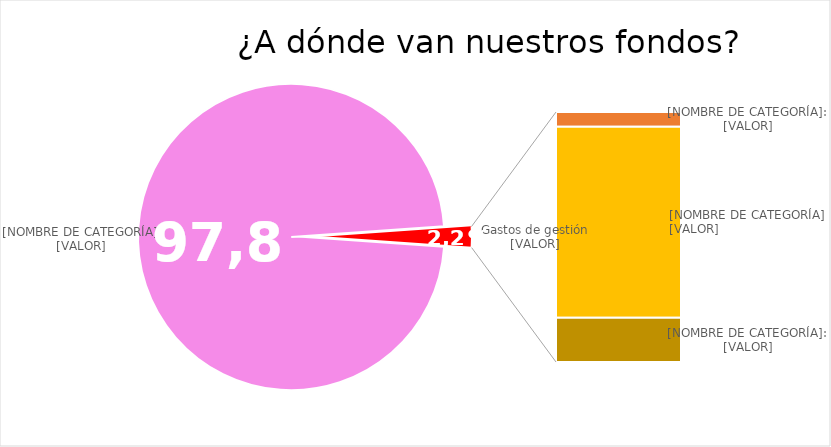
| Category | Series 0 |
|---|---|
| Ahorro | 7494.22 |
| Teléfono | 10 |
| Comisiones bancarias | 129.48 |
| Web | 30.06 |